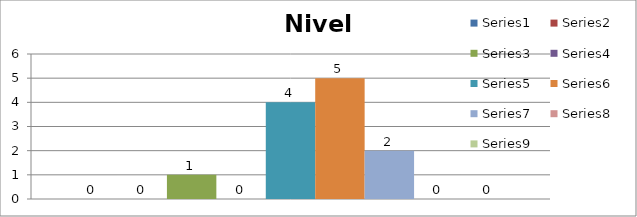
| Category | Series 0 | Series 1 | Series 2 | Series 3 | Series 4 | Series 5 | Series 6 | Series 7 | Series 8 |
|---|---|---|---|---|---|---|---|---|---|
| 0 | 0 | 0 | 1 | 0 | 4 | 5 | 2 | 0 | 0 |